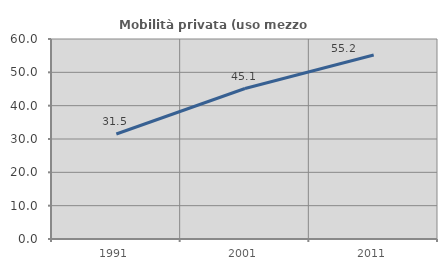
| Category | Mobilità privata (uso mezzo privato) |
|---|---|
| 1991.0 | 31.508 |
| 2001.0 | 45.141 |
| 2011.0 | 55.179 |